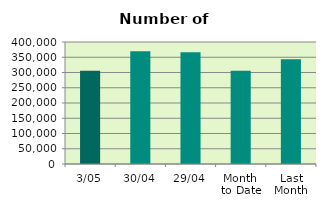
| Category | Series 0 |
|---|---|
| 3/05 | 305964 |
| 30/04 | 369376 |
| 29/04 | 366066 |
| Month 
to Date | 305964 |
| Last
Month | 343067.2 |